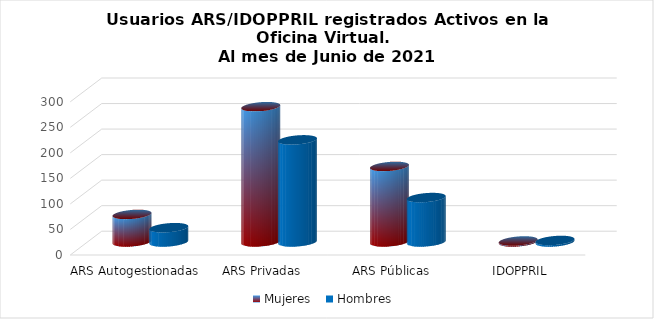
| Category | Mujeres | Hombres |
|---|---|---|
| ARS Autogestionadas | 54 | 28 |
| ARS Privadas | 265 | 200 |
| ARS Públicas | 148 | 87 |
| IDOPPRIL | 2 | 3 |